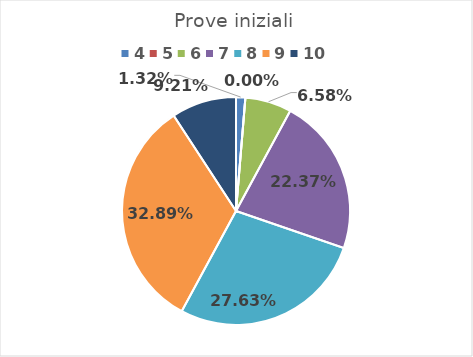
| Category | Series 0 |
|---|---|
| 4.0 | 0.013 |
| 5.0 | 0 |
| 6.0 | 0.066 |
| 7.0 | 0.224 |
| 8.0 | 0.276 |
| 9.0 | 0.329 |
| 10.0 | 0.092 |